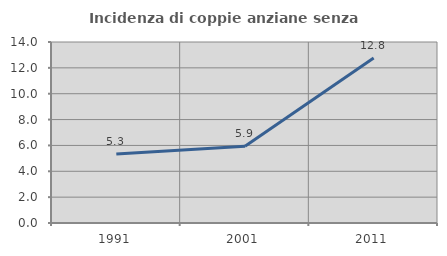
| Category | Incidenza di coppie anziane senza figli  |
|---|---|
| 1991.0 | 5.338 |
| 2001.0 | 5.944 |
| 2011.0 | 12.758 |